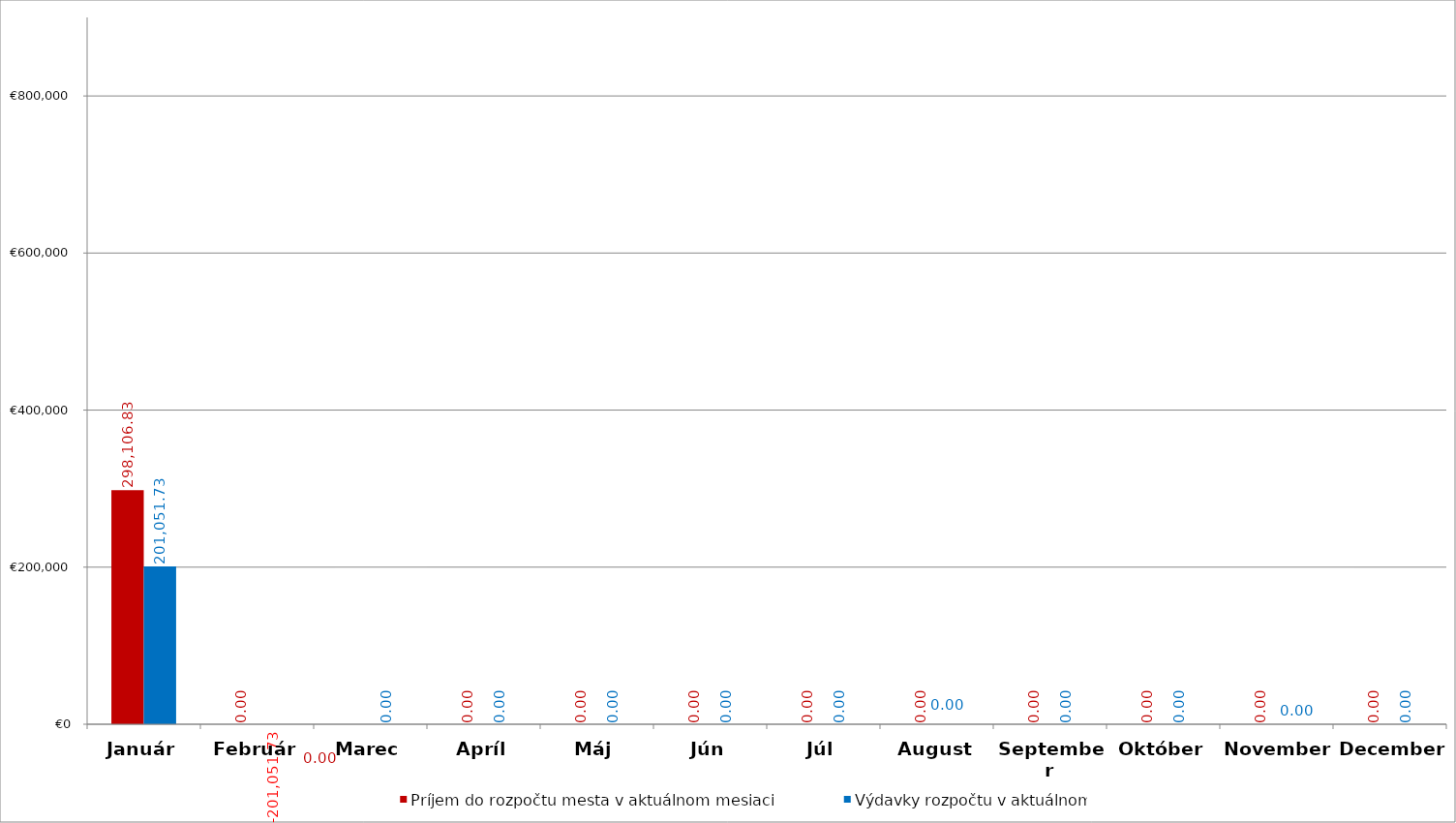
| Category | Príjem do rozpočtu mesta v aktuálnom mesiaci | Výdavky rozpočtu v aktuálnom  mesiaci |
|---|---|---|
| Január | 298106.83 | 201051.73 |
| Február | 0 | -201051.73 |
| Marec | 0 | 0 |
| Apríl | 0 | 0 |
| Máj | 0 | 0 |
| Jún | 0 | 0 |
| Júl | 0 | 0 |
| August | 0 | 0 |
| September | 0 | 0 |
| Október | 0 | 0 |
| November | 0 | 0 |
| December | 0 | 0 |